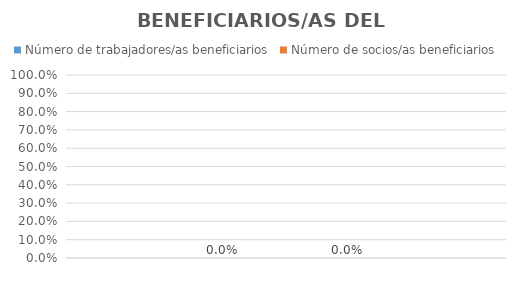
| Category | Número de trabajadores/as beneficiarios | Número de socios/as beneficiarios |
|---|---|---|
| 0 | 0 | 0 |